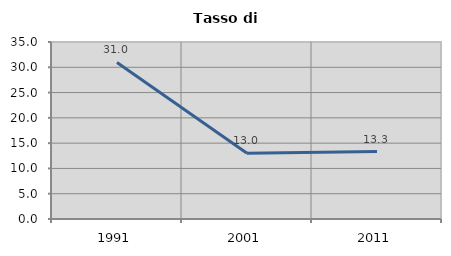
| Category | Tasso di disoccupazione   |
|---|---|
| 1991.0 | 30.96 |
| 2001.0 | 13 |
| 2011.0 | 13.333 |